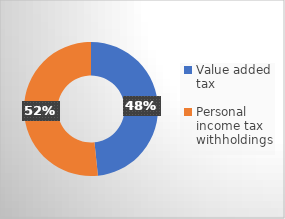
| Category | Taxes Collected |
|---|---|
| Value added tax | 105040 |
| Personal income tax  withholdings | 112203 |